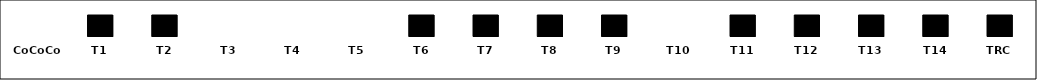
| Category | Series 0 |
|---|---|
| CoCoCo | 0 |
| T1 | 1 |
| T2 | 1 |
| T3 | 0 |
| T4 | 0 |
| T5 | 0 |
| T6 | 1 |
| T7 | 1 |
| T8 | 1 |
| T9 | 1 |
| T10 | 0 |
| T11 | 1 |
| T12 | 1 |
| T13 | 1 |
| T14 | 1 |
| TRC | 1 |